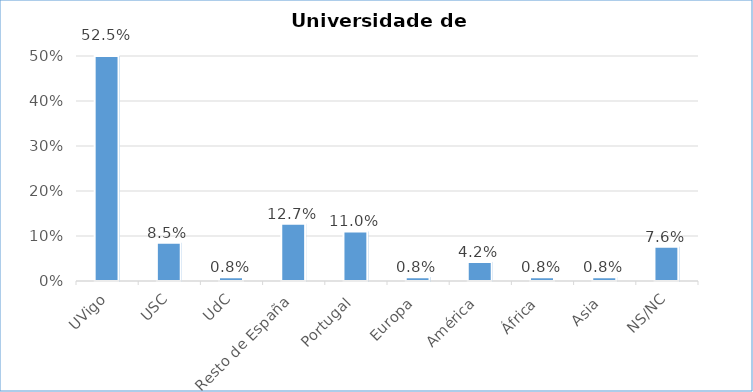
| Category | Universidade de procedencia |
|---|---|
| UVigo | 0.525 |
| USC | 0.085 |
| UdC | 0.008 |
| Resto de España | 0.127 |
| Portugal | 0.11 |
| Europa | 0.008 |
| América | 0.042 |
| África | 0.008 |
| Asia | 0.008 |
| NS/NC | 0.076 |